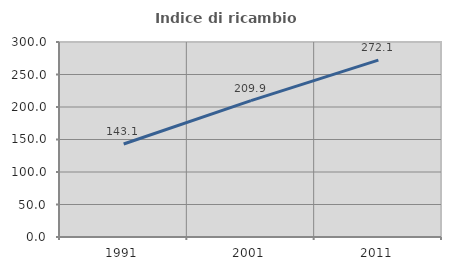
| Category | Indice di ricambio occupazionale  |
|---|---|
| 1991.0 | 143.13 |
| 2001.0 | 209.906 |
| 2011.0 | 272.131 |